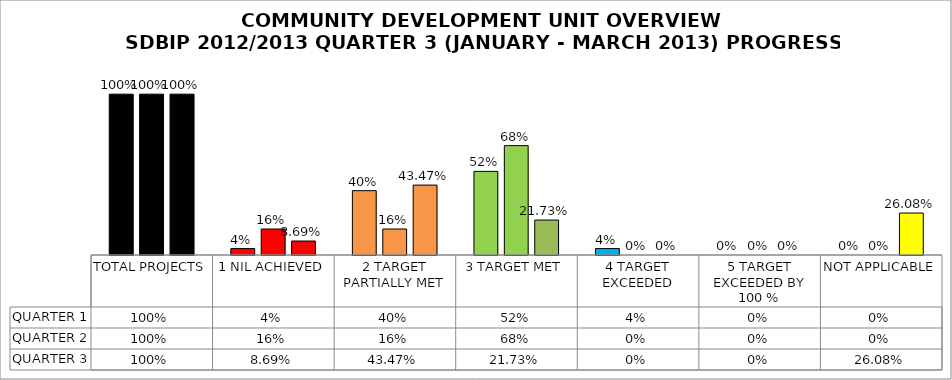
| Category | QUARTER 1 | QUARTER 2 | QUARTER 3 |
|---|---|---|---|
| TOTAL PROJECTS | 1 | 1 | 1 |
| 1 NIL ACHIEVED | 0.04 | 0.162 | 0.087 |
| 2 TARGET PARTIALLY MET | 0.4 | 0.162 | 0.435 |
| 3 TARGET MET | 0.52 | 0.68 | 0.217 |
| 4 TARGET EXCEEDED | 0.04 | 0 | 0 |
| 5 TARGET EXCEEDED BY 100 % | 0 | 0 | 0 |
| NOT APPLICABLE | 0 | 0 | 0.261 |